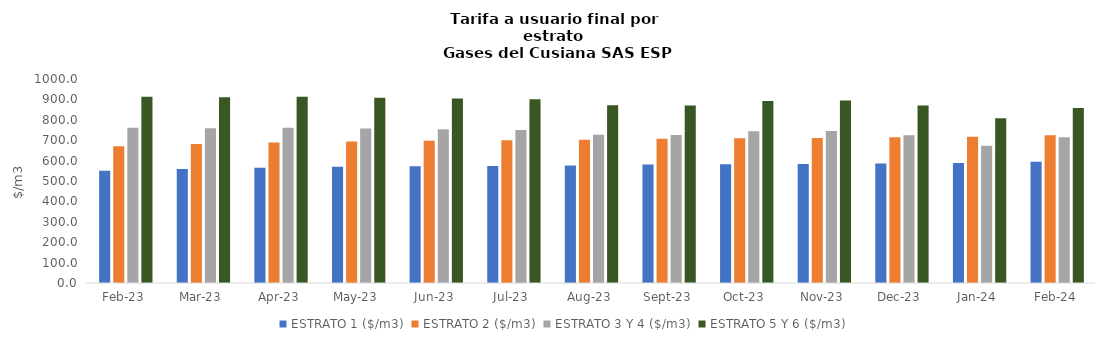
| Category | ESTRATO 1 ($/m3) | ESTRATO 2 ($/m3) | ESTRATO 3 Y 4 ($/m3) | ESTRATO 5 Y 6 ($/m3) |
|---|---|---|---|---|
| 2023-02-01 | 550.34 | 670.8 | 760.69 | 912.828 |
| 2023-03-01 | 559.36 | 681.79 | 758.71 | 910.452 |
| 2023-04-01 | 565.3 | 689.03 | 760.69 | 912.828 |
| 2023-05-01 | 569.53 | 694.19 | 757.13 | 908.556 |
| 2023-06-01 | 571.88 | 697.06 | 753.75 | 904.5 |
| 2023-07-01 | 573.63 | 699.2 | 750.21 | 900.252 |
| 2023-08-01 | 576.45 | 702.64 | 726.44 | 871.728 |
| 2023-09-01 | 580.51 | 707.59 | 725.31 | 870.372 |
| 2023-10-01 | 581.75 | 709.1 | 743.81 | 892.572 |
| 2023-11-01 | 583.2 | 710.87 | 745.28 | 894.336 |
| 2023-12-01 | 585.94 | 714.2 | 724.84 | 869.808 |
| 2024-01-01 | 588.63 | 717.48 | 672.77 | 807.324 |
| 2024-02-01 | 594.02 | 724.04 | 714.4 | 857.28 |